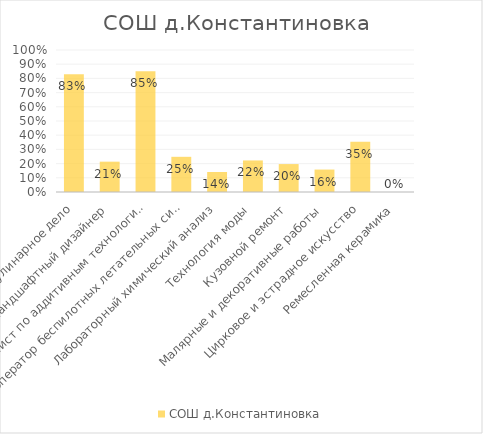
| Category | СОШ д.Константиновка |
|---|---|
| Кулинарное дело | 0.829 |
| Ландшафтный дизайнер | 0.214 |
| Специалист по аддитивным технологиям | 0.85 |
| Оператор беспилотных летательных систем | 0.248 |
| Лабораторный химический анализ | 0.141 |
| Технология моды | 0.222 |
| Кузовной ремонт | 0.197 |
| Малярные и декоративные работы | 0.158 |
| Цирковое и эстрадное искусство | 0.355 |
| Ремесленная керамика | 0 |